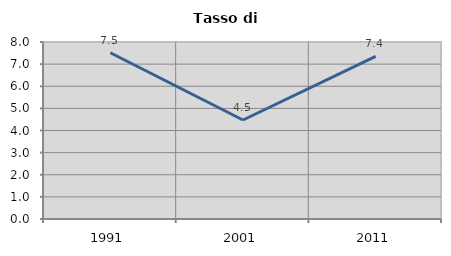
| Category | Tasso di disoccupazione   |
|---|---|
| 1991.0 | 7.514 |
| 2001.0 | 4.474 |
| 2011.0 | 7.354 |